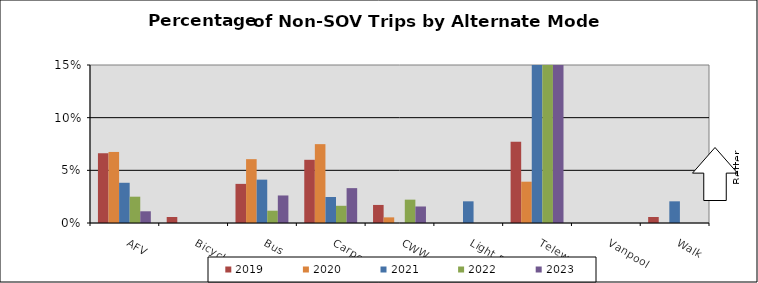
| Category | 2019 | 2020 | 2021 | 2022 | 2023 |
|---|---|---|---|---|---|
| AFV | 0.066 | 0.067 | 0.038 | 0.025 | 0.011 |
| Bicycle | 0.006 | 0 | 0 | 0 | 0 |
| Bus | 0.037 | 0.061 | 0.041 | 0.012 | 0.026 |
| Carpool | 0.06 | 0.075 | 0.025 | 0.016 | 0.033 |
| CWW | 0.017 | 0.005 | 0 | 0.022 | 0.016 |
| Light Rail | 0 | 0 | 0.021 | 0 | 0 |
| Telework | 0.077 | 0.039 | 0.366 | 0.371 | 0.495 |
| Vanpool | 0 | 0 | 0 | 0 | 0 |
| Walk | 0.006 | 0 | 0.021 | 0 | 0 |